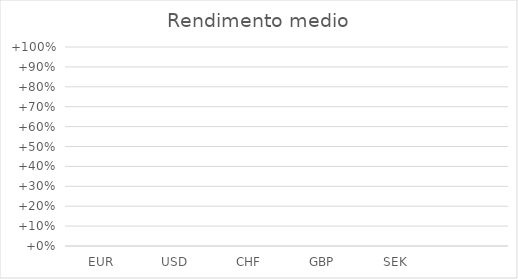
| Category | Rendimento medio |
|---|---|
| EUR | 0 |
| USD | 0 |
| CHF | 0 |
| GBP | 0 |
| SEK | 0 |